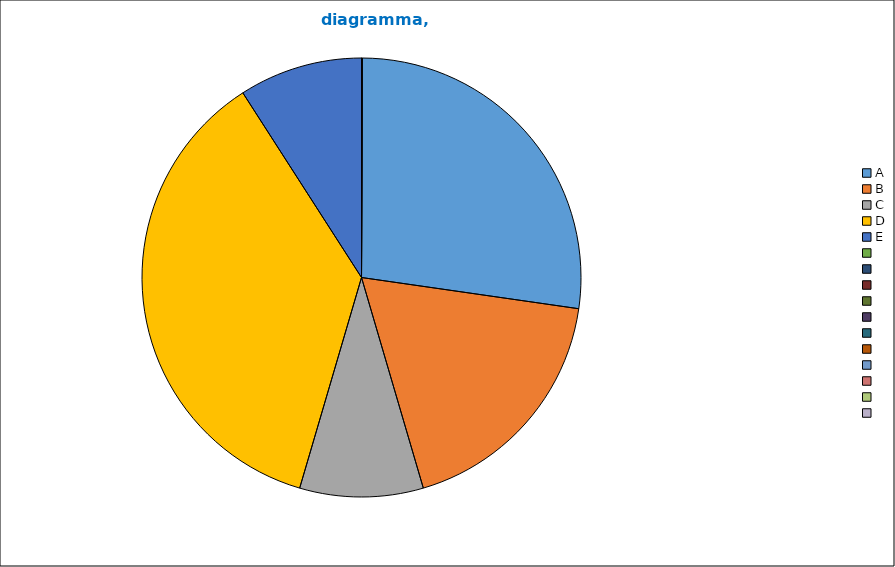
| Category | diagramma, titolo |
|---|---|
| A | 3 |
| B | 2 |
| C | 1 |
| D | 4 |
| E | 1 |